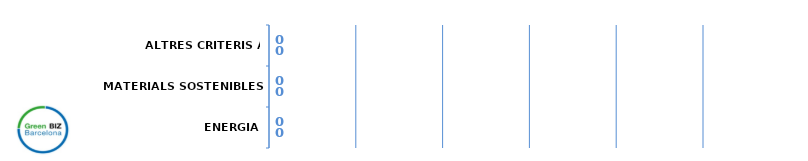
| Category | Series 0 | Series 1 |
|---|---|---|
| ENERGIA | 0 | 0 |
| MATERIALS SOSTENIBLES | 0 | 0 |
| ALTRES CRITERIS A CONSIDERAR | 0 | 0 |